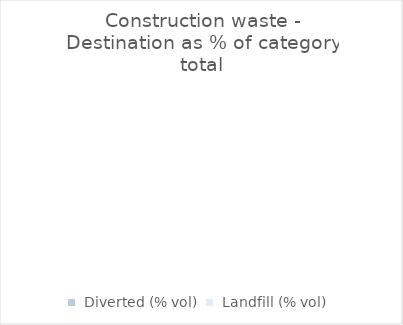
| Category |  Construction Waste  |
|---|---|
|  Diverted (% vol)  | 0 |
|  Landfill (% vol)  | 0 |